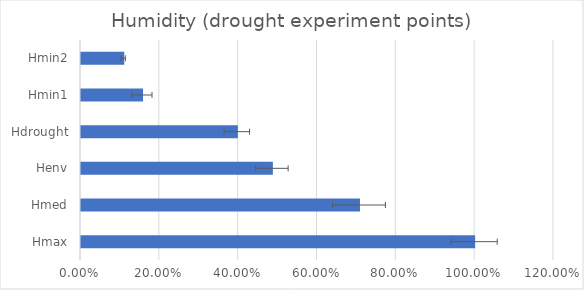
| Category | Humidity |
|---|---|
| Hmax | 1 |
| Hmed | 0.708 |
| Henv | 0.487 |
| Hdrought | 0.398 |
| Hmin1 | 0.157 |
| Hmin2 | 0.11 |